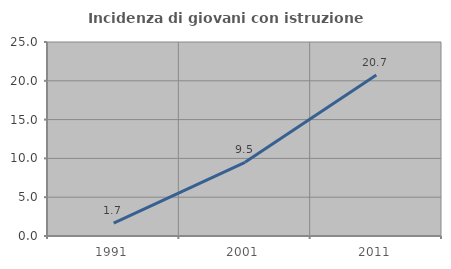
| Category | Incidenza di giovani con istruzione universitaria |
|---|---|
| 1991.0 | 1.658 |
| 2001.0 | 9.501 |
| 2011.0 | 20.734 |